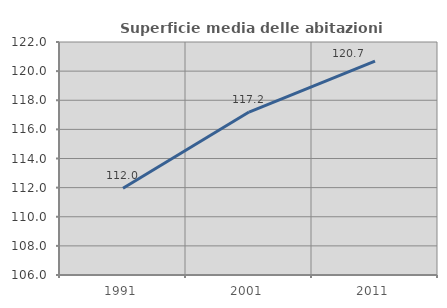
| Category | Superficie media delle abitazioni occupate |
|---|---|
| 1991.0 | 111.951 |
| 2001.0 | 117.188 |
| 2011.0 | 120.684 |